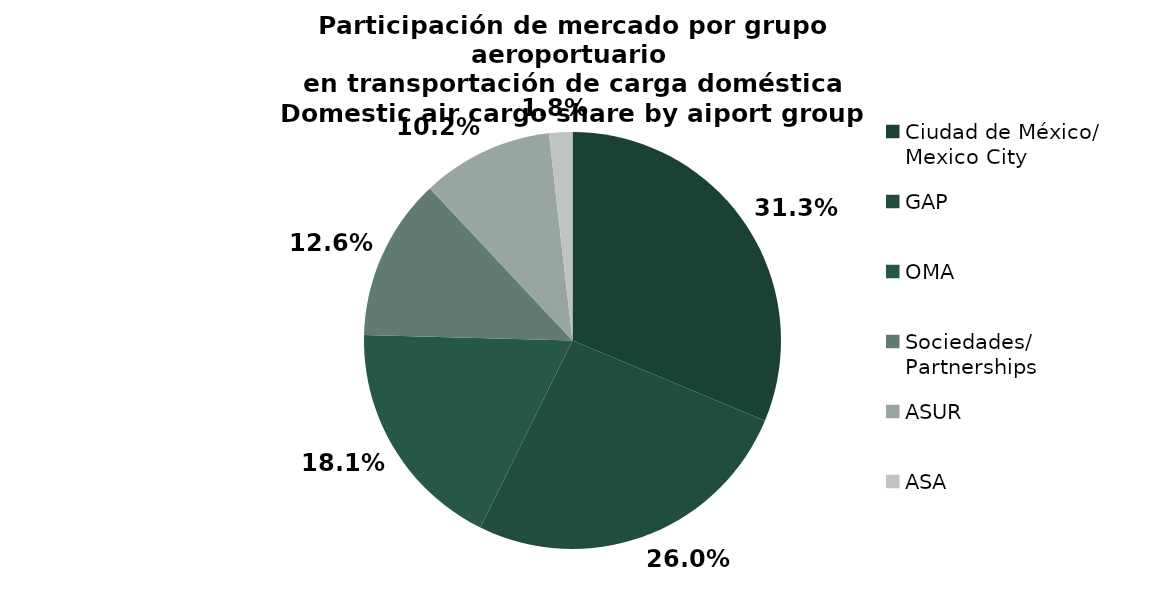
| Category | Series 0 |
|---|---|
| Ciudad de México/
Mexico City | 7782.3 |
| GAP | 6466.483 |
| OMA | 4509.074 |
| Sociedades/
Partnerships | 3132.884 |
| ASUR | 2532.494 |
| ASA | 449.273 |